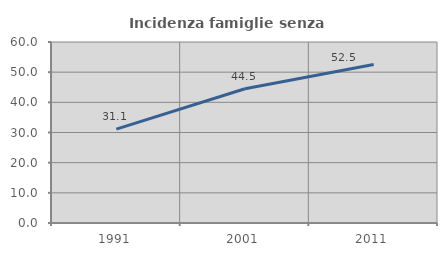
| Category | Incidenza famiglie senza nuclei |
|---|---|
| 1991.0 | 31.111 |
| 2001.0 | 44.492 |
| 2011.0 | 52.535 |